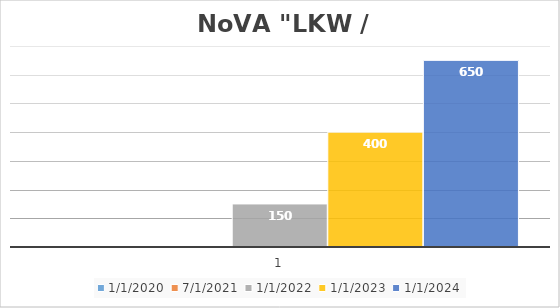
| Category | 01.01.2020 | 01.07.2021 | 01.01.2022 | 01.01.2023 | 01.01.2024 |
|---|---|---|---|---|---|
| 0 | 0 | 0 | 150 | 400 | 650 |